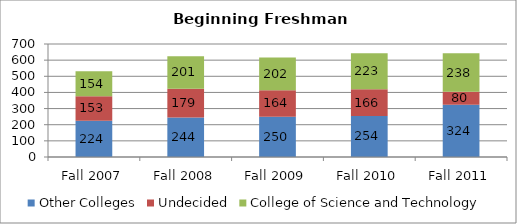
| Category | Other Colleges | Undecided | College of Science and Technology |
|---|---|---|---|
| Fall 2007 | 224 | 153 | 154 |
| Fall 2008 | 244 | 179 | 201 |
| Fall 2009 | 250 | 164 | 202 |
| Fall 2010 | 254 | 166 | 223 |
| Fall 2011 | 324 | 80 | 238 |